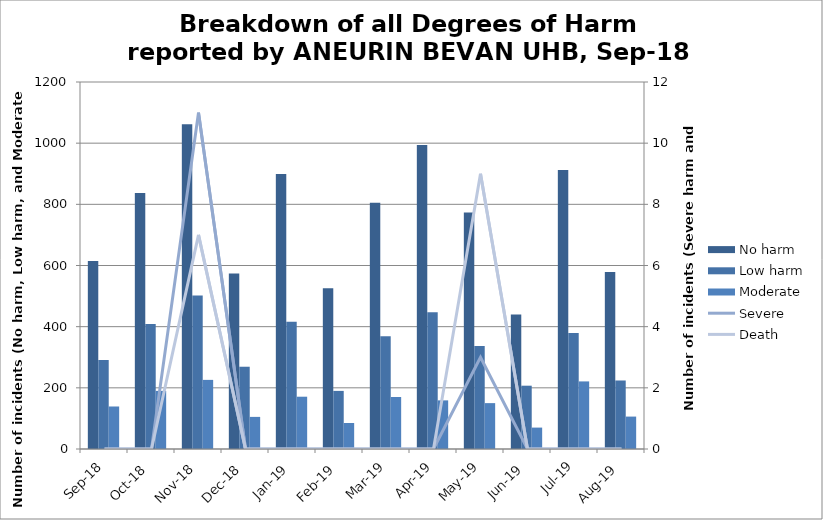
| Category | No harm | Low harm | Moderate |
|---|---|---|---|
| Sep-18 | 615 | 291 | 139 |
| Oct-18 | 837 | 409 | 190 |
| Nov-18 | 1062 | 502 | 226 |
| Dec-18 | 574 | 269 | 105 |
| Jan-19 | 899 | 416 | 171 |
| Feb-19 | 526 | 190 | 85 |
| Mar-19 | 805 | 369 | 170 |
| Apr-19 | 994 | 447 | 159 |
| May-19 | 773 | 337 | 150 |
| Jun-19 | 440 | 207 | 70 |
| Jul-19 | 912 | 379 | 221 |
| Aug-19 | 579 | 224 | 106 |